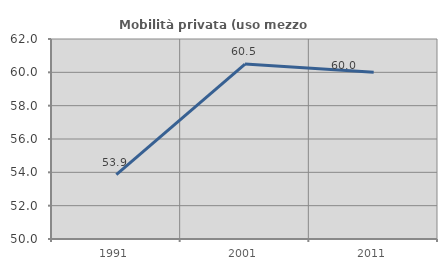
| Category | Mobilità privata (uso mezzo privato) |
|---|---|
| 1991.0 | 53.866 |
| 2001.0 | 60.494 |
| 2011.0 | 60 |